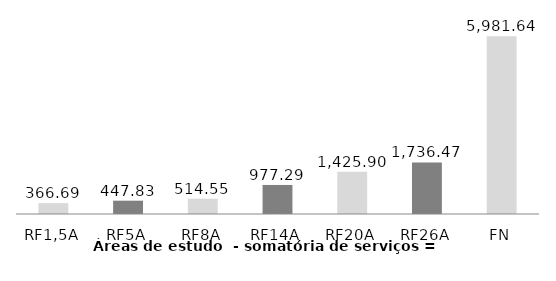
| Category | Series 0 |
|---|---|
| RF1,5A | 366.69 |
| RF5A | 447.831 |
| RF8A | 514.551 |
| RF14A | 977.287 |
| RF20A | 1425.903 |
| RF26A | 1736.475 |
| FN | 5981.644 |